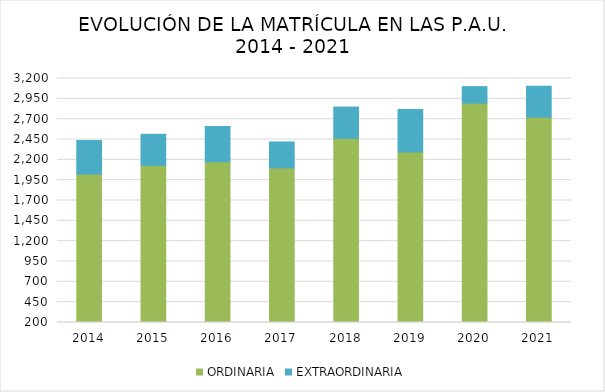
| Category | ORDINARIA | EXTRAORDINARIA |
|---|---|---|
| 2014.0 | 2025 | 413 |
| 2015.0 | 2132 | 382 |
| 2016.0 | 2177 | 432 |
| 2017.0 | 2101 | 319 |
| 2018.0 | 2464 | 385 |
| 2019.0 | 2296 | 524 |
| 2020.0 | 2897 | 203 |
| 2021.0 | 2725 | 380 |